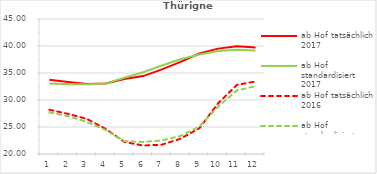
| Category | ab Hof tatsächlich 2017 | ab Hof standardisiert 2017 | ab Hof tatsächlich 2016 | ab Hof standardisiert 2016 |
|---|---|---|---|---|
| 0 | 33.76 | 33.055 | 28.192 | 27.711 |
| 1 | 33.35 | 32.933 | 27.438 | 27.005 |
| 2 | 32.979 | 32.918 | 26.5 | 25.942 |
| 3 | 33.054 | 33.039 | 24.664 | 24.448 |
| 4 | 33.901 | 34.12 | 22.237 | 22.36 |
| 5 | 34.424 | 35.139 | 21.567 | 22.233 |
| 6 | 35.662 | 36.385 | 21.728 | 22.509 |
| 7 | 37.05 | 37.55 | 22.841 | 23.338 |
| 8 | 38.603 | 38.424 | 24.77 | 25.075 |
| 9 | 39.514 | 39.092 | 29.396 | 28.775 |
| 10 | 39.959 | 39.294 | 32.8 | 31.775 |
| 11 | 39.742 | 39.157 | 33.427 | 32.558 |